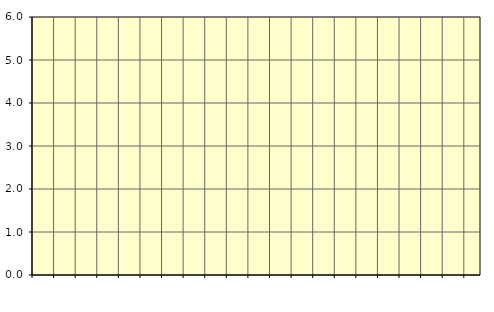
| Category | Piggar | Transport, SNI 49-531 |
|---|---|---|
| nan | 8.1 | 8.05 |
| 1.0 | 7.9 | 7.96 |
| 1.0 | 7.9 | 7.86 |
| 1.0 | 7.7 | 7.79 |
| nan | 7.8 | 7.79 |
| 2.0 | 7.9 | 7.83 |
| 2.0 | 7.8 | 7.87 |
| 2.0 | 8 | 7.87 |
| nan | 7.8 | 7.8 |
| 3.0 | 7.8 | 7.69 |
| 3.0 | 7.5 | 7.59 |
| 3.0 | 7.6 | 7.49 |
| nan | 7.4 | 7.41 |
| 4.0 | 7.3 | 7.33 |
| 4.0 | 7.4 | 7.24 |
| 4.0 | 7 | 7.19 |
| nan | 7.2 | 7.23 |
| 5.0 | 7.3 | 7.33 |
| 5.0 | 7.5 | 7.4 |
| 5.0 | 7.4 | 7.43 |
| nan | 7.5 | 7.43 |
| 6.0 | 7.4 | 7.46 |
| 6.0 | 7.4 | 7.52 |
| 6.0 | 7.6 | 7.58 |
| nan | 7.5 | 7.62 |
| 7.0 | 7.7 | 7.65 |
| 7.0 | 7.7 | 7.72 |
| 7.0 | 7.8 | 7.74 |
| nan | 7.7 | 7.68 |
| 8.0 | 7.5 | 7.54 |
| 8.0 | 7.5 | 7.4 |
| 8.0 | 7.2 | 7.3 |
| nan | 7.2 | 7.25 |
| 9.0 | 7.2 | 7.25 |
| 9.0 | 7.4 | 7.3 |
| 9.0 | 7.4 | 7.42 |
| nan | 7.7 | 7.58 |
| 10.0 | 7.8 | 7.71 |
| 10.0 | 7.7 | 7.79 |
| 10.0 | 7.9 | 7.8 |
| nan | 7.8 | 7.74 |
| 11.0 | 7.6 | 7.63 |
| 11.0 | 7.5 | 7.53 |
| 11.0 | 7.5 | 7.49 |
| nan | 7.4 | 7.47 |
| 12.0 | 7.5 | 7.45 |
| 12.0 | 7.4 | 7.47 |
| 12.0 | 7.5 | 7.54 |
| nan | 7.6 | 7.66 |
| 13.0 | 7.8 | 7.75 |
| 13.0 | 7.7 | 7.75 |
| 13.0 | 7.7 | 7.71 |
| nan | 7.7 | 7.7 |
| 14.0 | 7.6 | 7.77 |
| 14.0 | 8 | 7.81 |
| 14.0 | 7.6 | 7.76 |
| nan | 7.7 | 7.68 |
| 15.0 | 7.6 | 7.64 |
| 15.0 | 7.7 | 7.63 |
| 15.0 | 7.6 | 7.61 |
| nan | 7.6 | 7.58 |
| 16.0 | 7.7 | 7.58 |
| 16.0 | 7.6 | 7.62 |
| 16.0 | 7.8 | 7.7 |
| nan | 7.7 | 7.78 |
| 17.0 | 7.9 | 7.83 |
| 17.0 | 7.8 | 7.84 |
| 17.0 | 7.8 | 7.87 |
| nan | 7.9 | 7.85 |
| 18.0 | 8 | 7.75 |
| 18.0 | 7.5 | 7.66 |
| 18.0 | 7.8 | 7.64 |
| nan | 7.8 | 7.77 |
| 19.0 | 7.8 | 7.91 |
| 19.0 | 8.2 | 7.96 |
| 19.0 | 7.6 | 7.94 |
| nan | 7.6 | 7.49 |
| 20.0 | 6.6 | 6.76 |
| 20.0 | 6.8 | 6.86 |
| 20.0 | 7.2 | 6.83 |
| nan | 6.5 | 6.71 |
| 21.0 | 6.5 | 6.62 |
| 21.0 | 6.7 | 6.67 |